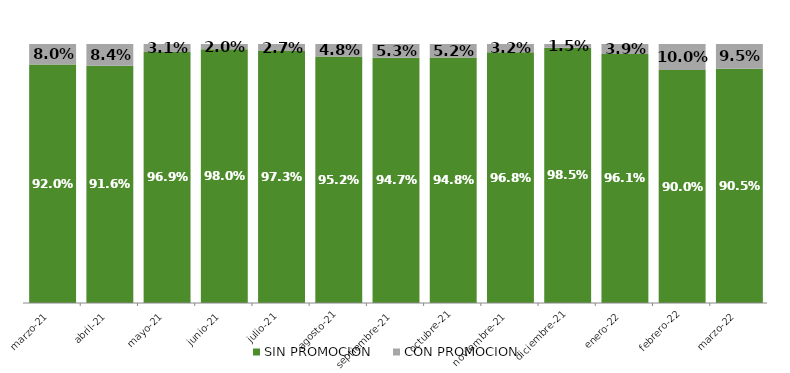
| Category | SIN PROMOCION   | CON PROMOCION   |
|---|---|---|
| 2021-03-01 | 0.92 | 0.08 |
| 2021-04-01 | 0.916 | 0.084 |
| 2021-05-01 | 0.969 | 0.031 |
| 2021-06-01 | 0.98 | 0.02 |
| 2021-07-01 | 0.973 | 0.027 |
| 2021-08-01 | 0.952 | 0.048 |
| 2021-09-01 | 0.947 | 0.053 |
| 2021-10-01 | 0.948 | 0.052 |
| 2021-11-01 | 0.968 | 0.032 |
| 2021-12-01 | 0.985 | 0.015 |
| 2022-01-01 | 0.961 | 0.039 |
| 2022-02-01 | 0.9 | 0.1 |
| 2022-03-01 | 0.905 | 0.095 |